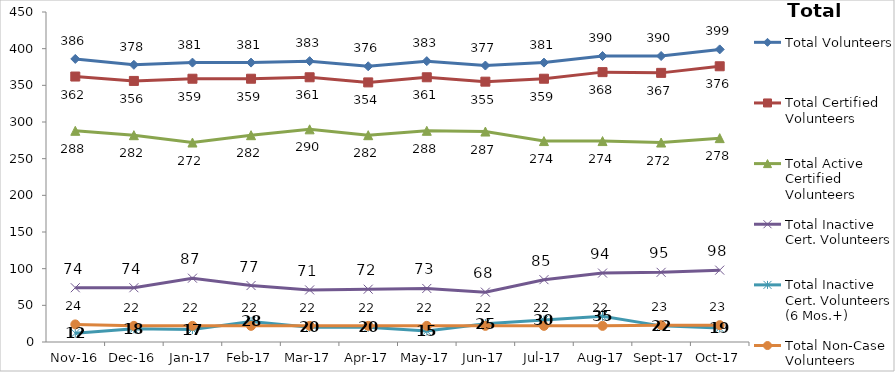
| Category | Total Volunteers | Total Certified Volunteers | Total Active Certified Volunteers | Total Inactive Cert. Volunteers | Total Inactive Cert. Volunteers (6 Mos.+) | Total Non-Case Volunteers |
|---|---|---|---|---|---|---|
| 2016-11-01 | 386 | 362 | 288 | 74 | 12 | 24 |
| 2016-12-01 | 378 | 356 | 282 | 74 | 18 | 22 |
| 2017-01-01 | 381 | 359 | 272 | 87 | 17 | 22 |
| 2017-02-01 | 381 | 359 | 282 | 77 | 28 | 22 |
| 2017-03-01 | 383 | 361 | 290 | 71 | 20 | 22 |
| 2017-04-01 | 376 | 354 | 282 | 72 | 20 | 22 |
| 2017-05-01 | 383 | 361 | 288 | 73 | 15 | 22 |
| 2017-06-01 | 377 | 355 | 287 | 68 | 25 | 22 |
| 2017-07-01 | 381 | 359 | 274 | 85 | 30 | 22 |
| 2017-08-01 | 390 | 368 | 274 | 94 | 35 | 22 |
| 2017-09-01 | 390 | 367 | 272 | 95 | 22 | 23 |
| 2017-10-01 | 399 | 376 | 278 | 98 | 19 | 23 |